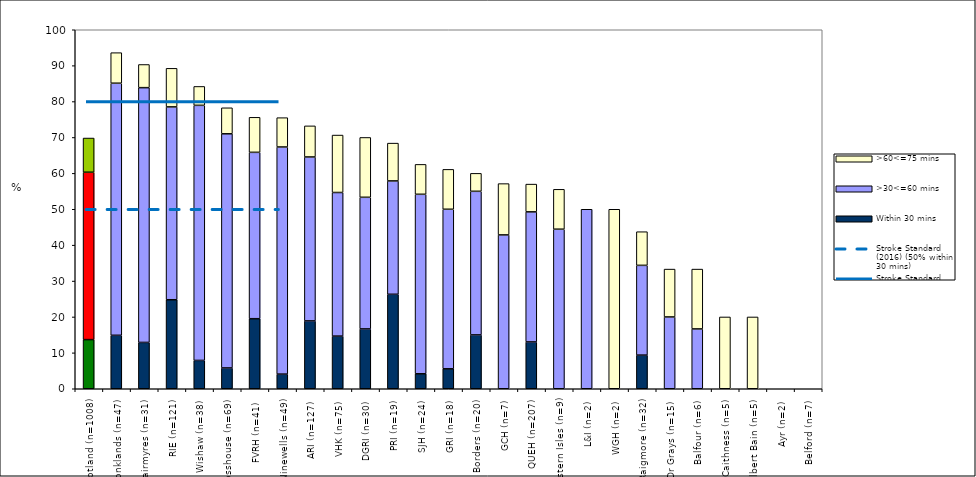
| Category | Within 30 mins | >30<=60 mins | >60<=75 mins |
|---|---|---|---|
| Scotland (n=1008) | 13.69 | 46.627 | 9.524 |
| Monklands (n=47) | 14.894 | 70.213 | 8.511 |
| Hairmyres (n=31) | 12.903 | 70.968 | 6.452 |
| RIE (n=121) | 24.793 | 53.719 | 10.744 |
| Wishaw (n=38) | 7.895 | 71.053 | 5.263 |
| Crosshouse (n=69) | 5.797 | 65.217 | 7.246 |
| FVRH (n=41) | 19.512 | 46.341 | 9.756 |
| Ninewells (n=49) | 4.082 | 63.265 | 8.163 |
| ARI (n=127) | 18.898 | 45.669 | 8.661 |
| VHK (n=75) | 14.667 | 40 | 16 |
| DGRI (n=30) | 16.667 | 36.667 | 16.667 |
| PRI (n=19) | 26.316 | 31.579 | 10.526 |
| SJH (n=24) | 4.167 | 50 | 8.333 |
| GRI (n=18) | 5.556 | 44.444 | 11.111 |
| Borders (n=20) | 15 | 40 | 5 |
| GCH (n=7) | 0 | 42.857 | 14.286 |
| QUEH (n=207) | 13.043 | 36.232 | 7.729 |
| Western Isles (n=9) | 0 | 44.444 | 11.111 |
| L&I (n=2) | 0 | 50 | 0 |
| WGH (n=2) | 0 | 0 | 50 |
| Raigmore (n=32) | 9.375 | 25 | 9.375 |
| Dr Grays (n=15) | 0 | 20 | 13.333 |
| Balfour (n=6) | 0 | 16.667 | 16.667 |
| Caithness (n=5) | 0 | 0 | 20 |
| Gilbert Bain (n=5) | 0 | 0 | 20 |
| Ayr (n=2) | 0 | 0 | 0 |
| Belford (n=7) | 0 | 0 | 0 |